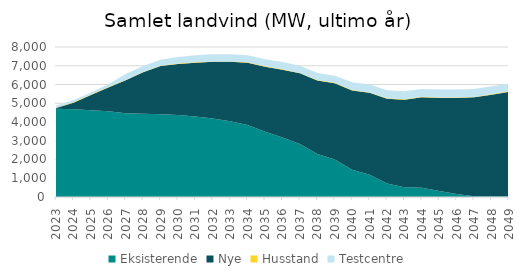
| Category | Eksisterende | Nye | Husstand | Testcentre |
|---|---|---|---|---|
| 2023.0 | 4704.6 | 39.6 | 22.2 | 110 |
| 2024.0 | 4682.25 | 342.7 | 22.3 | 110 |
| 2025.0 | 4626.37 | 814.7 | 22.4 | 110 |
| 2026.0 | 4579.68 | 1259.7 | 22.5 | 150 |
| 2027.0 | 4461.83 | 1759.7 | 22.6 | 310 |
| 2028.0 | 4440.71 | 2209.7 | 22.7 | 310 |
| 2029.0 | 4411.05 | 2569.7 | 22.8 | 310 |
| 2030.0 | 4371.1 | 2719.7 | 22.9 | 350 |
| 2031.0 | 4290.88 | 2869.7 | 23 | 380 |
| 2032.0 | 4190.2 | 3019.7 | 23.1 | 380 |
| 2033.0 | 4040.28 | 3169.7 | 23.2 | 380 |
| 2034.0 | 3839.7 | 3319.7 | 23.3 | 380 |
| 2035.0 | 3474.27 | 3469.7 | 23.4 | 380 |
| 2036.0 | 3170.38 | 3619.7 | 23.5 | 380 |
| 2037.0 | 2825.68 | 3769.7 | 23.6 | 380 |
| 2038.0 | 2294.37 | 3919.7 | 23.7 | 380 |
| 2039.0 | 1996.18 | 4069.7 | 23.8 | 380 |
| 2040.0 | 1458.34 | 4219.7 | 23.9 | 420 |
| 2041.0 | 1184.53 | 4369.7 | 24 | 420 |
| 2042.0 | 725.37 | 4519.7 | 24.1 | 420 |
| 2043.0 | 520.41 | 4669.7 | 24.2 | 420 |
| 2044.0 | 499.14 | 4819.7 | 24.3 | 420 |
| 2045.0 | 314.98 | 4969.7 | 24.4 | 420 |
| 2046.0 | 165.58 | 5119.7 | 24.5 | 420 |
| 2047.0 | 44.13 | 5269.7 | 24.6 | 420 |
| 2048.0 | 37.68 | 5419.7 | 24.7 | 420 |
| 2049.0 | 35.13 | 5569.7 | 24.8 | 420 |